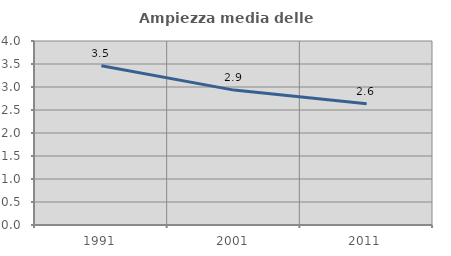
| Category | Ampiezza media delle famiglie |
|---|---|
| 1991.0 | 3.46 |
| 2001.0 | 2.932 |
| 2011.0 | 2.636 |